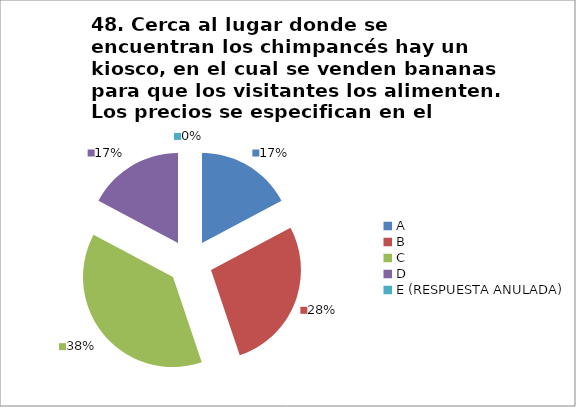
| Category | CANTIDAD DE RESPUESTAS PREGUNTA (48) | PORCENTAJE |
|---|---|---|
| A | 5 | 0.172 |
| B | 8 | 0.276 |
| C | 11 | 0.379 |
| D | 5 | 0.172 |
| E (RESPUESTA ANULADA) | 0 | 0 |